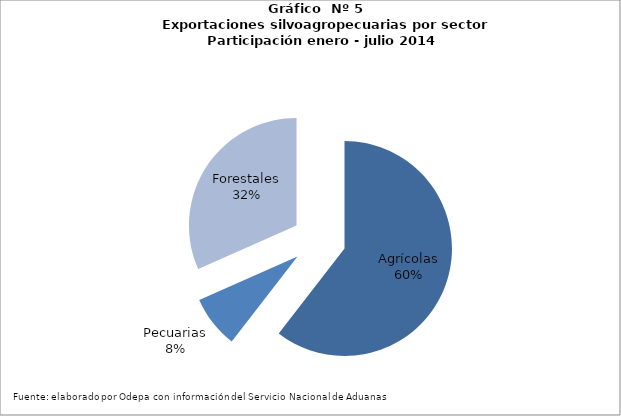
| Category | Series 0 |
|---|---|
| Agrícolas | 5971340 |
| Pecuarias | 777874 |
| Forestales | 3124242 |